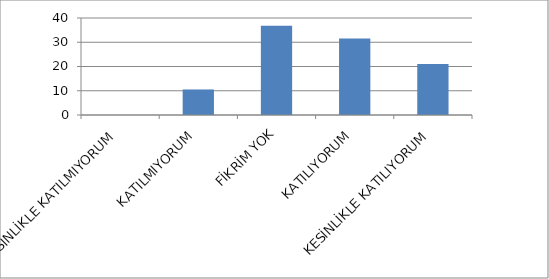
| Category | Series 0 |
|---|---|
| KESİNLİKLE KATILMIYORUM | 0 |
| KATILMIYORUM | 10.53 |
| FİKRİM YOK | 36.84 |
| KATILIYORUM | 31.58 |
| KESİNLİKLE KATILIYORUM | 21.05 |